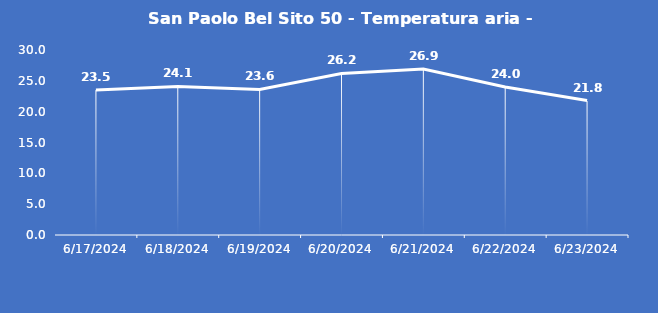
| Category | San Paolo Bel Sito 50 - Temperatura aria - Grezzo (°C) |
|---|---|
| 6/17/24 | 23.5 |
| 6/18/24 | 24.1 |
| 6/19/24 | 23.6 |
| 6/20/24 | 26.2 |
| 6/21/24 | 26.9 |
| 6/22/24 | 24 |
| 6/23/24 | 21.8 |